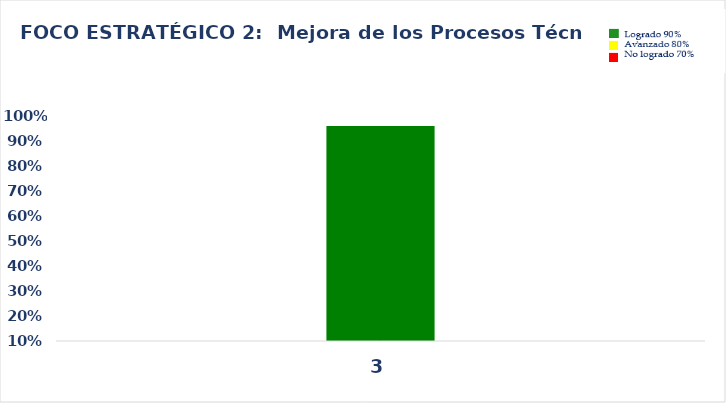
| Category | Series 0 |
|---|---|
| 3.0 | 0.96 |